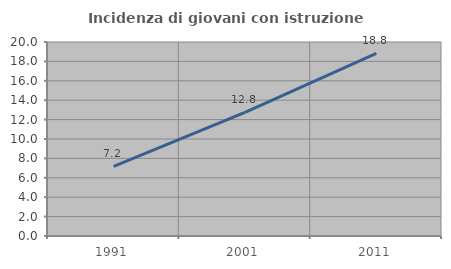
| Category | Incidenza di giovani con istruzione universitaria |
|---|---|
| 1991.0 | 7.183 |
| 2001.0 | 12.753 |
| 2011.0 | 18.832 |